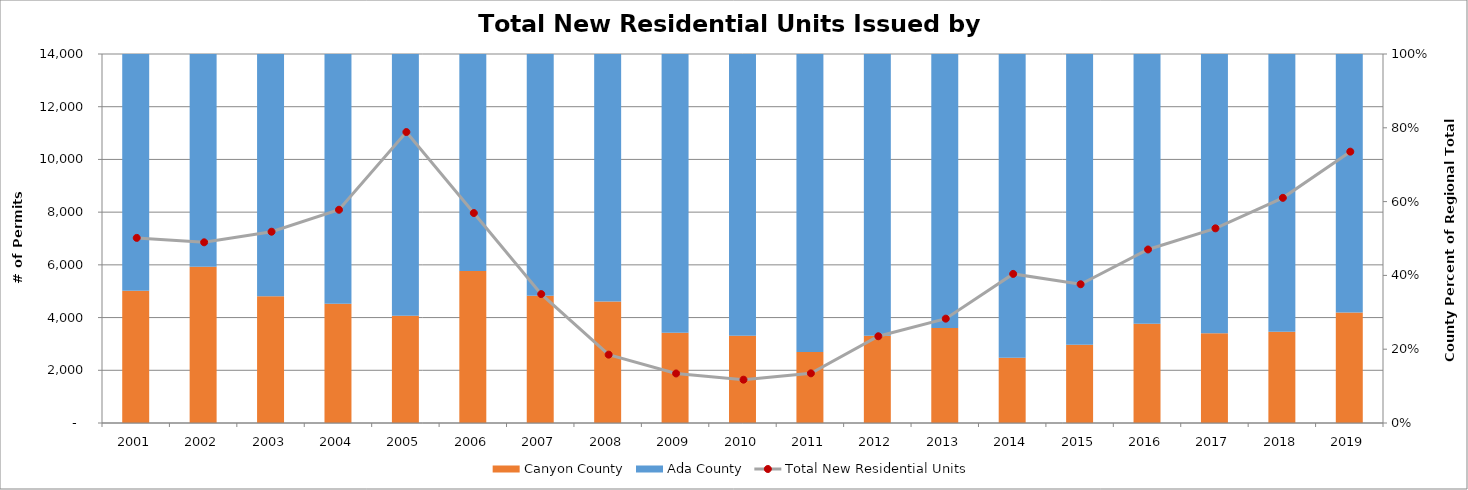
| Category | Canyon County | Ada County |
|---|---|---|
| 2001.0 | 0.359 | 0.641 |
| 2002.0 | 0.423 | 0.577 |
| 2003.0 | 0.344 | 0.656 |
| 2004.0 | 0.323 | 0.677 |
| 2005.0 | 0.291 | 0.709 |
| 2006.0 | 0.412 | 0.588 |
| 2007.0 | 0.345 | 0.655 |
| 2008.0 | 0.329 | 0.671 |
| 2009.0 | 0.245 | 0.755 |
| 2010.0 | 0.237 | 0.763 |
| 2011.0 | 0.193 | 0.807 |
| 2012.0 | 0.236 | 0.764 |
| 2013.0 | 0.258 | 0.742 |
| 2014.0 | 0.177 | 0.823 |
| 2015.0 | 0.212 | 0.788 |
| 2016.0 | 0.269 | 0.731 |
| 2017.0 | 0.243 | 0.757 |
| 2018.0 | 0.247 | 0.753 |
| 2019.0 | 0.3 | 0.7 |